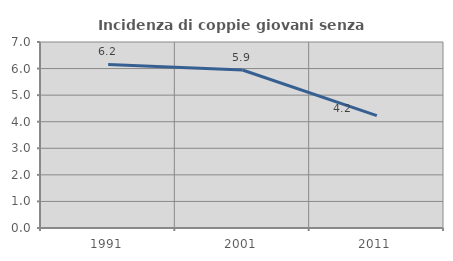
| Category | Incidenza di coppie giovani senza figli |
|---|---|
| 1991.0 | 6.154 |
| 2001.0 | 5.945 |
| 2011.0 | 4.232 |